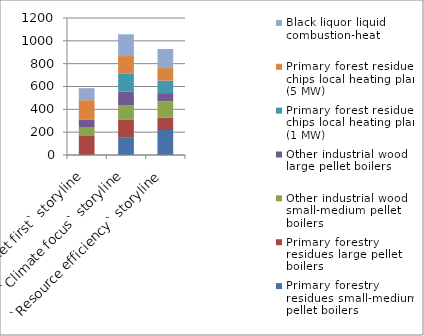
| Category | Primary forestry residues small-medium pellet boilers  | Primary forestry residues large pellet boilers  | Other industrial wood small-medium pellet boilers  | Other industrial wood large pellet boilers  | Primary forest residue chips local heating plant (1 MW)  | Primary forest residue chips local heating plant (5 MW)  | Black liquor liquid combustion-heat |
|---|---|---|---|---|---|---|---|
| `Market first` storyline | 0 | 172.637 | 67.299 | 67.299 | 0 | 172.637 | 105.338 |
| `Climate focus` storyline | 155.879 | 155.879 | 121.533 | 121.533 | 155.879 | 155.879 | 190.225 |
| `Resource efficiency` storyline | 219.068 | 109.534 | 142.332 | 71.166 | 109.534 | 109.534 | 167.085 |